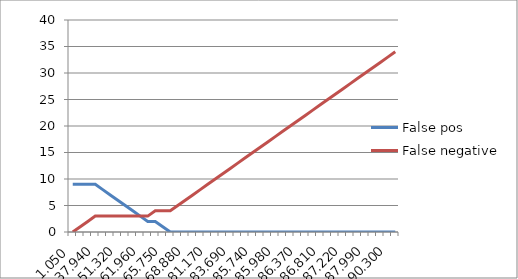
| Category | False pos | False negative |
|---|---|---|
| 1.050 | 9 | 0 |
| 28.970 | 9 | 1 |
| 28.970 | 9 | 2 |
| 37.940 | 9 | 3 |
| 46.020 | 8 | 3 |
| 48.860 | 7 | 3 |
| 51.320 | 6 | 3 |
| 54.450 | 5 | 3 |
| 57.690 | 4 | 3 |
| 61.960 | 3 | 3 |
| 64.910 | 2 | 3 |
| 64.920 | 2 | 4 |
| 65.750 | 1 | 4 |
| 66.490 | 0 | 4 |
| 67.460 | 0 | 5 |
| 68.880 | 0 | 6 |
| 75.240 | 0 | 7 |
| 81.040 | 0 | 8 |
| 81.170 | 0 | 9 |
| 82.180 | 0 | 10 |
| 83.120 | 0 | 11 |
| 83.690 | 0 | 12 |
| 83.690 | 0 | 13 |
| 84.580 | 0 | 14 |
| 85.740 | 0 | 15 |
| 85.790 | 0 | 16 |
| 85.980 | 0 | 17 |
| 85.980 | 0 | 18 |
| 85.980 | 0 | 19 |
| 86.210 | 0 | 20 |
| 86.370 | 0 | 21 |
| 86.370 | 0 | 22 |
| 86.370 | 0 | 23 |
| 86.810 | 0 | 24 |
| 86.930 | 0 | 25 |
| 87.050 | 0 | 26 |
| 87.220 | 0 | 27 |
| 87.330 | 0 | 28 |
| 87.830 | 0 | 29 |
| 87.990 | 0 | 30 |
| 87.990 | 0 | 31 |
| 90.300 | 0 | 32 |
| 90.300 | 0 | 33 |
| 90.300 | 0 | 34 |